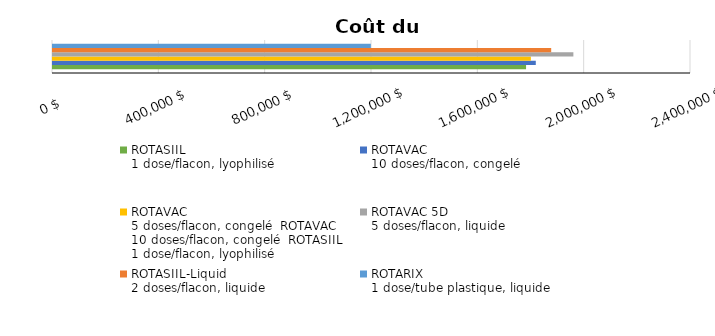
| Category | ROTASIIL
1 dose/flacon, lyophilisé | ROTAVAC
10 doses/flacon, congelé | ROTAVAC
5 doses/flacon, congelé ROTAVAC
10 doses/flacon, congelé ROTASIIL
1 dose/flacon, lyophilisé | ROTAVAC 5D
5 doses/flacon, liquide | ROTASIIL-Liquid
2 doses/flacon, liquide | ROTARIX
1 dose/tube plastique, liquide |
|---|---|---|---|---|---|---|
| Total
pour 5 ans | 1779540.706 | 1816148.161 | 1797651.763 | 1957528.679 | 1874076.442 | 1195677.438 |